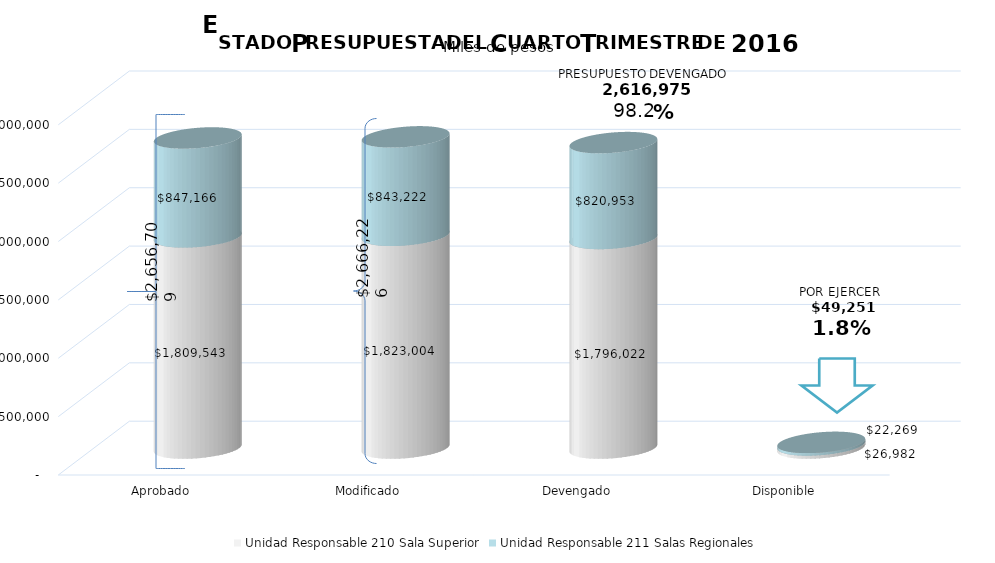
| Category | Unidad Responsable 210 Sala Superior | Unidad Responsable 211 Salas Regionales |
|---|---|---|
| Aprobado | 1809543 | 847166 |
| Modificado | 1823004 | 843222 |
| Devengado | 1796022 | 820953 |
| Disponible | 26982 | 22269 |